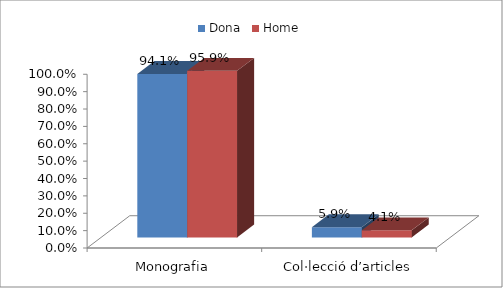
| Category | Dona | Home |
|---|---|---|
| Monografia | 0.941 | 0.959 |
| Col·lecció d’articles | 0.059 | 0.041 |